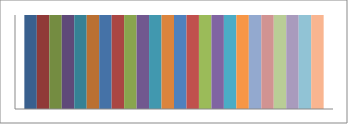
| Category | Series 1 | Series 2 | Series 3 | Series 4 | Series 5 | Series 6 | Series 7 | Series 8 | Series 9 | Series 10 | Series 11 | Series 12 | Series 13 | Series 14 | Series 15 | Series 16 | Series 17 | Series 18 | Series 19 | Series 20 | Series 21 | Series 22 | Series 23 | Series 24 |
|---|---|---|---|---|---|---|---|---|---|---|---|---|---|---|---|---|---|---|---|---|---|---|---|---|
| Point 1 | 1 | 1 | 1 | 1 | 1 | 1 | 1 | 1 | 1 | 1 | 1 | 1 | 1 | 1 | 1 | 1 | 1 | 1 | 1 | 1 | 1 | 1 | 1 | 1 |